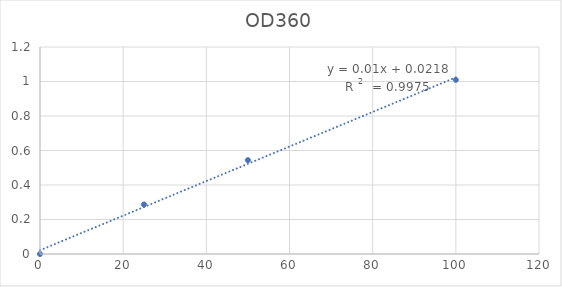
| Category | OD360 |
|---|---|
| 0.0 | 0 |
| 25.0 | 0.287 |
| 50.0 | 0.544 |
| 100.0 | 1.01 |